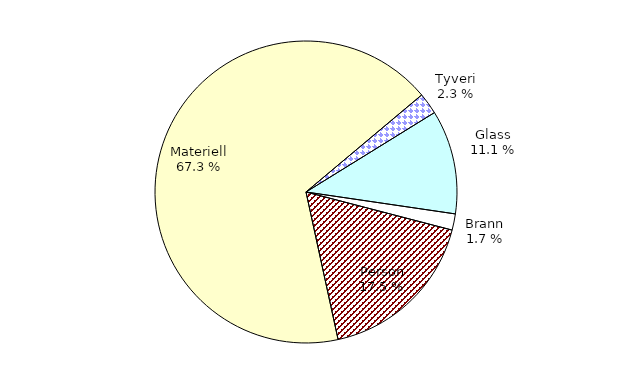
| Category | Series 0 |
|---|---|
| Tyveri | 211.353 |
| Glass | 1023.244 |
| Brann | 159.657 |
| Person | 1611.371 |
| Materiell | 6185.307 |